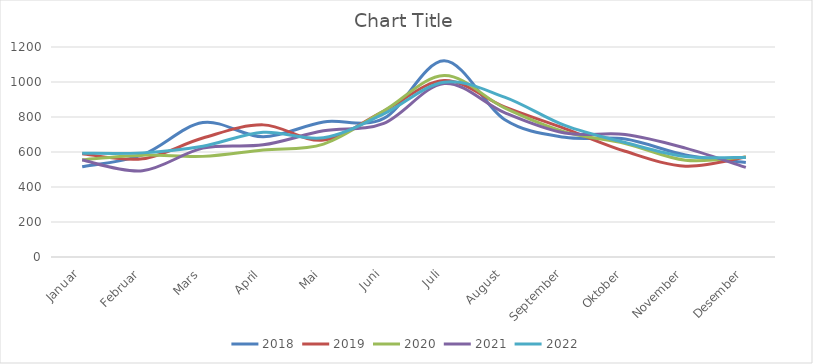
| Category | 2018 | 2019 | 2020 | 2021 | 2022 |
|---|---|---|---|---|---|
| Januar | 516 | 590 | 556 | 554 | 593 |
| Februar | 584 | 561 | 582 | 493 | 595 |
| Mars | 768 | 680 | 575 | 622 | 633 |
| April | 687 | 755 | 612 | 641 | 713 |
| Mai | 772 | 668 | 645 | 721 | 681 |
| Juni | 792 | 834 | 835 | 764 | 818 |
| Juli | 1121 | 1008 | 1037 | 991 | 999 |
| August | 786 | 858 | 852 | 825 | 914 |
| September | 684 | 734 | 715 | 708 | 752 |
| Oktober | 674 | 604 | 649 | 700 | 654 |
| November | 583 | 519 | 553 | 622 | 574 |
| Desember | 540 | 572 | 572 | 512 | 569 |